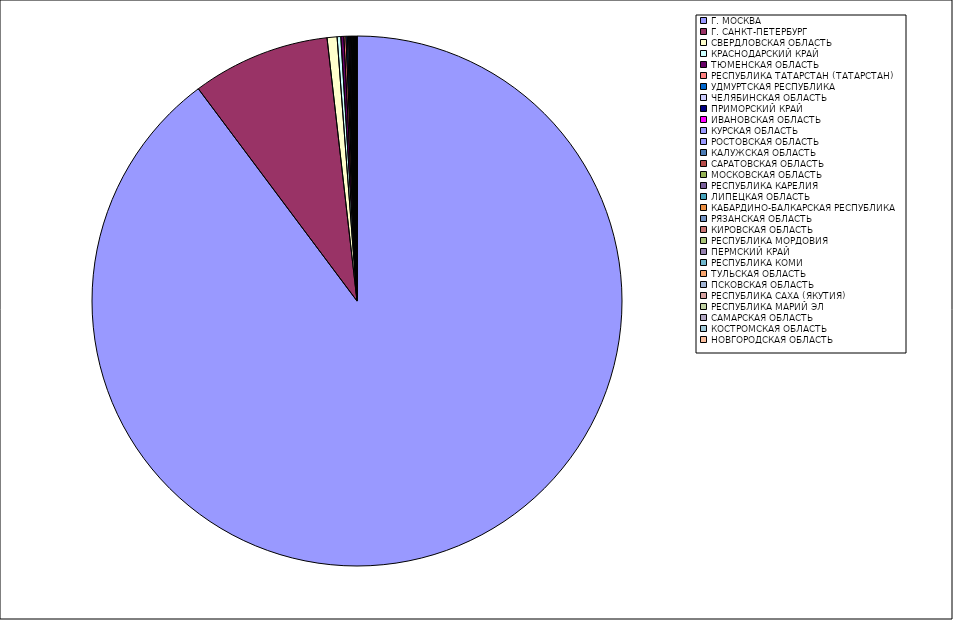
| Category | Оборот |
|---|---|
| Г. МОСКВА | 89.72 |
| Г. САНКТ-ПЕТЕРБУРГ | 8.406 |
| СВЕРДЛОВСКАЯ ОБЛАСТЬ | 0.607 |
| КРАСНОДАРСКИЙ КРАЙ | 0.224 |
| ТЮМЕНСКАЯ ОБЛАСТЬ | 0.184 |
| РЕСПУБЛИКА ТАТАРСТАН (ТАТАРСТАН) | 0.123 |
| УДМУРТСКАЯ РЕСПУБЛИКА | 0.086 |
| ЧЕЛЯБИНСКАЯ ОБЛАСТЬ | 0.07 |
| ПРИМОРСКИЙ КРАЙ | 0.064 |
| ИВАНОВСКАЯ ОБЛАСТЬ | 0.055 |
| КУРСКАЯ ОБЛАСТЬ | 0.051 |
| РОСТОВСКАЯ ОБЛАСТЬ | 0.045 |
| КАЛУЖСКАЯ ОБЛАСТЬ | 0.041 |
| САРАТОВСКАЯ ОБЛАСТЬ | 0.037 |
| МОСКОВСКАЯ ОБЛАСТЬ | 0.026 |
| РЕСПУБЛИКА КАРЕЛИЯ | 0.022 |
| ЛИПЕЦКАЯ ОБЛАСТЬ | 0.02 |
| КАБАРДИНО-БАЛКАРСКАЯ РЕСПУБЛИКА | 0.018 |
| РЯЗАНСКАЯ ОБЛАСТЬ | 0.015 |
| КИРОВСКАЯ ОБЛАСТЬ | 0.013 |
| РЕСПУБЛИКА МОРДОВИЯ | 0.013 |
| ПЕРМСКИЙ КРАЙ | 0.012 |
| РЕСПУБЛИКА КОМИ | 0.012 |
| ТУЛЬСКАЯ ОБЛАСТЬ | 0.012 |
| ПСКОВСКАЯ ОБЛАСТЬ | 0.011 |
| РЕСПУБЛИКА САХА (ЯКУТИЯ) | 0.01 |
| РЕСПУБЛИКА МАРИЙ ЭЛ | 0.009 |
| САМАРСКАЯ ОБЛАСТЬ | 0.009 |
| КОСТРОМСКАЯ ОБЛАСТЬ | 0.009 |
| НОВГОРОДСКАЯ ОБЛАСТЬ | 0.007 |